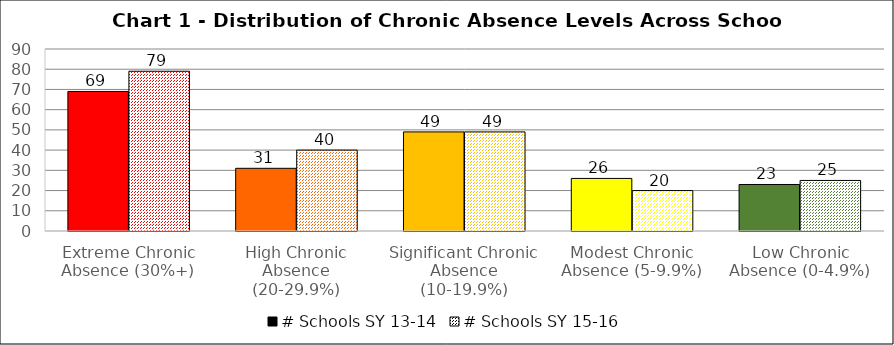
| Category | # Schools SY 13-14 | # Schools SY 15-16 |
|---|---|---|
| Extreme Chronic Absence (30%+) | 69 | 79 |
| High Chronic Absence (20-29.9%) | 31 | 40 |
| Significant Chronic Absence (10-19.9%) | 49 | 49 |
| Modest Chronic Absence (5-9.9%) | 26 | 20 |
| Low Chronic Absence (0-4.9%) | 23 | 25 |